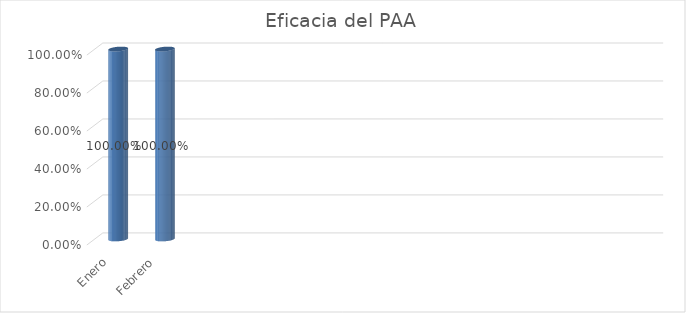
| Category | Series 0 |
|---|---|
| Enero | 1 |
| Febrero | 1 |